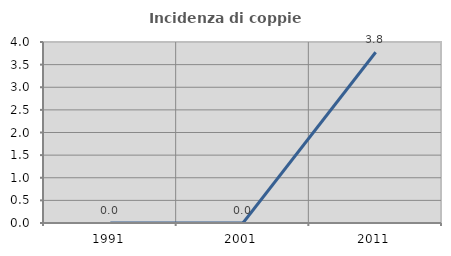
| Category | Incidenza di coppie miste |
|---|---|
| 1991.0 | 0 |
| 2001.0 | 0 |
| 2011.0 | 3.774 |